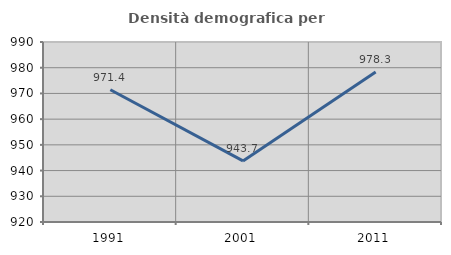
| Category | Densità demografica |
|---|---|
| 1991.0 | 971.448 |
| 2001.0 | 943.743 |
| 2011.0 | 978.334 |